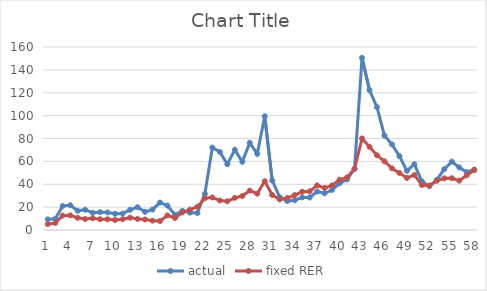
| Category | actual | fixed RER |
|---|---|---|
| 0 | 9.302 | 5.167 |
| 1 | 9.767 | 6.074 |
| 2 | 21.01 | 12.622 |
| 3 | 21.662 | 12.774 |
| 4 | 16.841 | 10.664 |
| 5 | 17.698 | 9.604 |
| 6 | 15.098 | 10.241 |
| 7 | 15.58 | 9.423 |
| 8 | 15.33 | 9.354 |
| 9 | 14.221 | 8.737 |
| 10 | 14.374 | 9.355 |
| 11 | 17.627 | 10.776 |
| 12 | 19.965 | 9.685 |
| 13 | 15.881 | 9.193 |
| 14 | 17.86 | 8.175 |
| 15 | 24.013 | 7.81 |
| 16 | 21.319 | 12.728 |
| 17 | 13.276 | 10.506 |
| 18 | 16.748 | 15.407 |
| 19 | 15.148 | 17.689 |
| 20 | 14.855 | 20.329 |
| 21 | 31.593 | 27.816 |
| 22 | 72.071 | 28.432 |
| 23 | 68.267 | 25.79 |
| 24 | 57.527 | 25.091 |
| 25 | 70.147 | 28.105 |
| 26 | 59.609 | 29.723 |
| 27 | 76.235 | 34.444 |
| 28 | 66.551 | 31.771 |
| 29 | 99.448 | 42.657 |
| 30 | 43.234 | 30.635 |
| 31 | 28.68 | 26.743 |
| 32 | 25.308 | 27.944 |
| 33 | 26.052 | 30.466 |
| 34 | 28.458 | 33.401 |
| 35 | 28.396 | 33.786 |
| 36 | 33.61 | 39.034 |
| 37 | 32.091 | 36.77 |
| 38 | 35.022 | 38.979 |
| 39 | 40.737 | 43.997 |
| 40 | 44.334 | 46.014 |
| 41 | 53.572 | 53.572 |
| 42 | 150.474 | 80.049 |
| 43 | 122.31 | 72.699 |
| 44 | 107.375 | 65.356 |
| 45 | 82.507 | 60.034 |
| 46 | 74.828 | 53.873 |
| 47 | 64.603 | 49.858 |
| 48 | 51.703 | 45.497 |
| 49 | 57.603 | 48.13 |
| 50 | 42.525 | 39.29 |
| 51 | 38.227 | 38.851 |
| 52 | 43.9 | 43.071 |
| 53 | 53.261 | 45.201 |
| 54 | 59.784 | 45.28 |
| 55 | 54.694 | 43.176 |
| 56 | 50.551 | 47.822 |
| 57 | 52.937 | 52.288 |